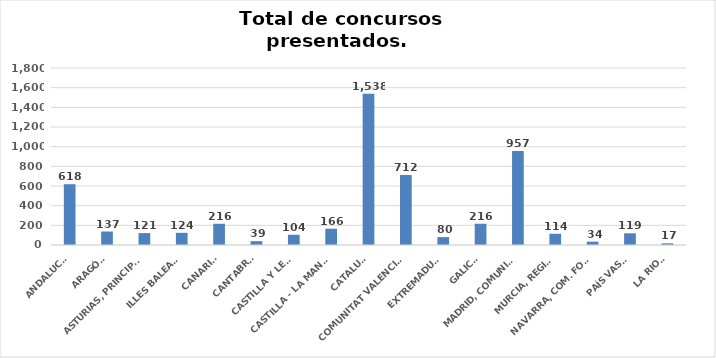
| Category | Series 0 |
|---|---|
| ANDALUCÍA | 618 |
| ARAGÓN | 137 |
| ASTURIAS, PRINCIPADO | 121 |
| ILLES BALEARS | 124 |
| CANARIAS | 216 |
| CANTABRIA | 39 |
| CASTILLA Y LEÓN | 104 |
| CASTILLA - LA MANCHA | 166 |
| CATALUÑA | 1538 |
| COMUNITAT VALENCIANA | 712 |
| EXTREMADURA | 80 |
| GALICIA | 216 |
| MADRID, COMUNIDAD | 957 |
| MURCIA, REGIÓN | 114 |
| NAVARRA, COM. FORAL | 34 |
| PAÍS VASCO | 119 |
| LA RIOJA | 17 |